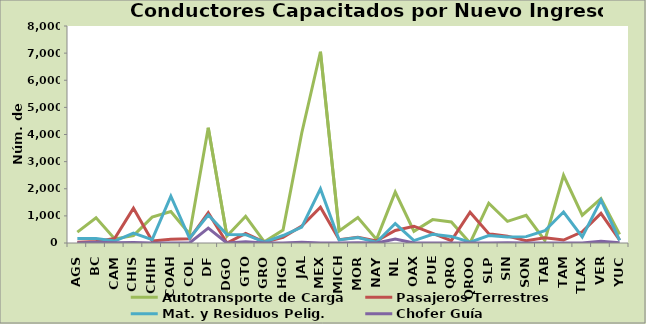
| Category | Autotransporte de Carga | Pasajeros Terrestres | Mat. y Residuos Pelig. | Chofer Guía |
|---|---|---|---|---|
| AGS | 401 | 28 | 165 | 0 |
| BC | 930 | 58 | 168 | 26 |
| CAM | 152 | 170 | 71 | 8 |
| CHIS | 270 | 1285 | 368 | 17 |
| CHIH | 952 | 77 | 123 | 0 |
| COAH | 1160 | 135 | 1726 | 0 |
| COL | 330 | 156 | 175 | 4 |
| DF | 4248 | 1120 | 1034 | 548 |
| DGO | 257 | 0 | 313 | 0 |
| GTO | 985 | 351 | 307 | 49 |
| GRO | 45 | 30 | 34 | 0 |
| HGO | 477 | 208 | 275 | 0 |
| JAL | 4057 | 624 | 584 | 32 |
| MEX | 7050 | 1321 | 1995 | 0 |
| MICH | 443 | 120 | 113 | 0 |
| MOR | 935 | 210 | 199 | 5 |
| NAY | 133 | 78 | 29 | 0 |
| NL | 1876 | 463 | 717 | 142 |
| OAX | 433 | 619 | 90 | 0 |
| PUE | 862 | 353 | 321 | 0 |
| QRO | 776 | 89 | 243 | 0 |
| QROO | 0 | 1133 | 28 | 0 |
| SLP | 1468 | 345 | 274 | 0 |
| SIN | 796 | 254 | 224 | 10 |
| SON | 1020 | 87 | 235 | 0 |
| TAB | 92 | 191 | 452 | 0 |
| TAM | 2494 | 109 | 1143 | 0 |
| TLAX | 1025 | 414 | 227 | 0 |
| VER | 1633 | 1094 | 1579 | 67 |
| YUC | 318 | 110 | 101 | 6 |